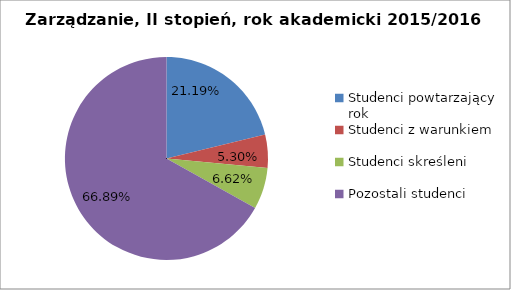
| Category | Series 0 |
|---|---|
| Studenci powtarzający rok | 32 |
| Studenci z warunkiem | 8 |
| Studenci skreśleni | 10 |
| Pozostali studenci | 101 |